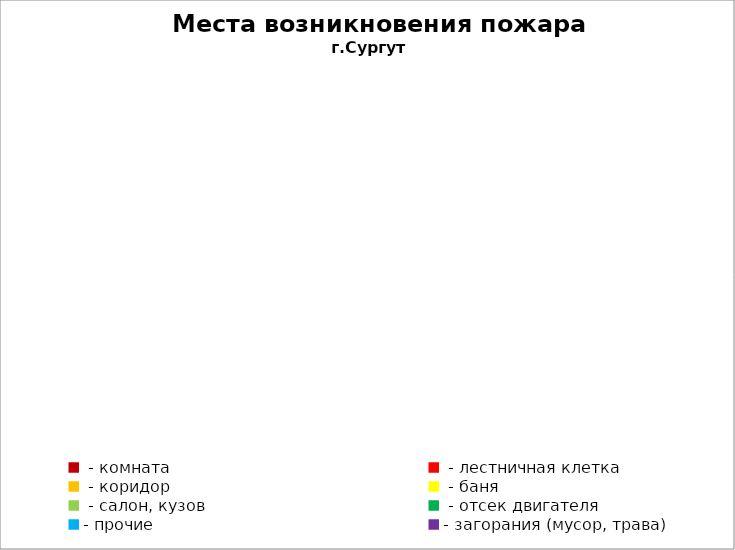
| Category | Места возникновения пожара |
|---|---|
|  - комната | 72 |
|  - лестничная клетка | 11 |
|  - коридор | 7 |
|  - баня | 39 |
|  - салон, кузов | 18 |
|  - отсек двигателя | 46 |
| - прочие | 127 |
| - загорания (мусор, трава)  | 41 |